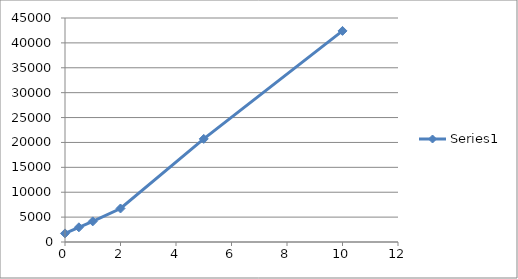
| Category | Series 0 |
|---|---|
| 0.0 | 1726 |
| 0.5 | 2950 |
| 1.0 | 4141 |
| 2.0 | 6731 |
| 5.0 | 20711 |
| 10.0 | 42409 |